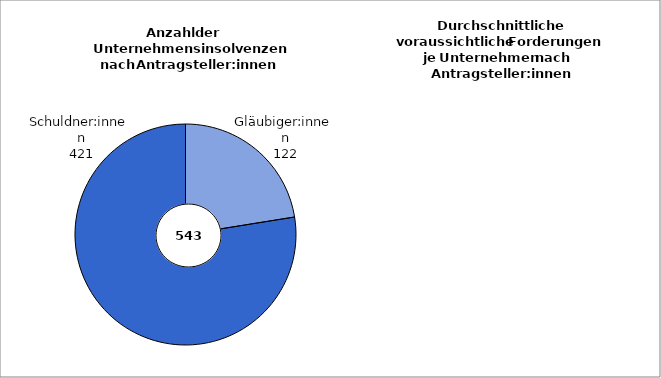
| Category | Series 0 |
|---|---|
| Gläubiger:innen | 122 |
| Schuldner:innen | 421 |